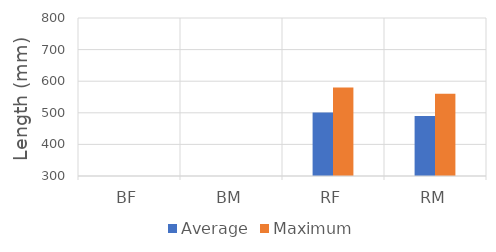
| Category | Average | Maximum |
|---|---|---|
| BF | 0 | 0 |
| BM | 0 | 0 |
| RF | 501 | 580 |
| RM | 490 | 560 |